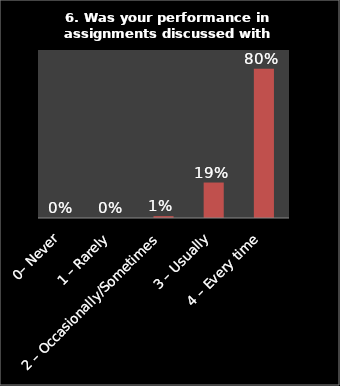
| Category | Series 0 |
|---|---|
| 0– Never | 0 |
| 1 – Rarely | 0 |
| 2 – Occasionally/Sometimes | 0.01 |
| 3 – Usually | 0.19 |
| 4 – Every time | 0.8 |